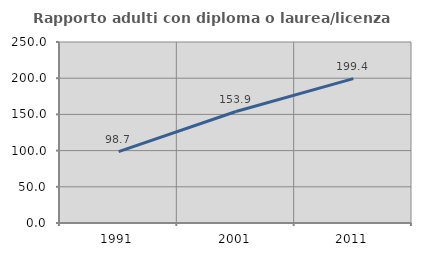
| Category | Rapporto adulti con diploma o laurea/licenza media  |
|---|---|
| 1991.0 | 98.658 |
| 2001.0 | 153.947 |
| 2011.0 | 199.408 |